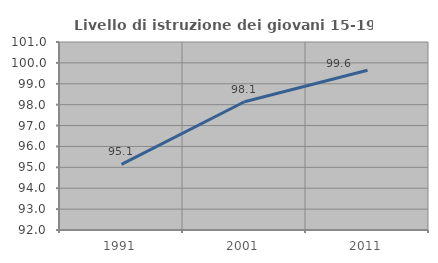
| Category | Livello di istruzione dei giovani 15-19 anni |
|---|---|
| 1991.0 | 95.146 |
| 2001.0 | 98.14 |
| 2011.0 | 99.647 |